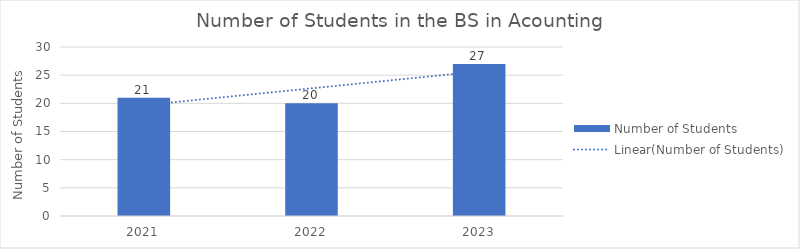
| Category | Number of Students |
|---|---|
| 2021.0 | 21 |
| 2022.0 | 20 |
| 2023.0 | 27 |